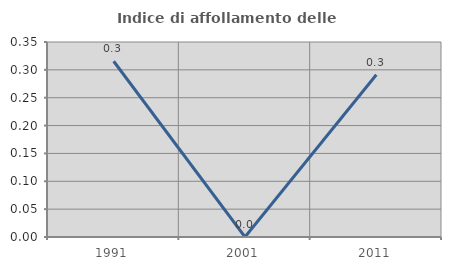
| Category | Indice di affollamento delle abitazioni  |
|---|---|
| 1991.0 | 0.315 |
| 2001.0 | 0 |
| 2011.0 | 0.291 |